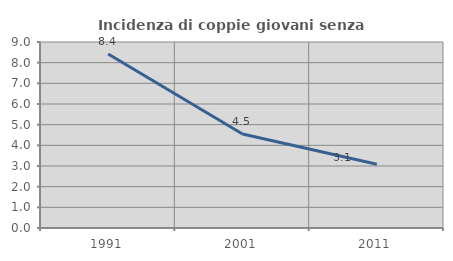
| Category | Incidenza di coppie giovani senza figli |
|---|---|
| 1991.0 | 8.421 |
| 2001.0 | 4.545 |
| 2011.0 | 3.084 |